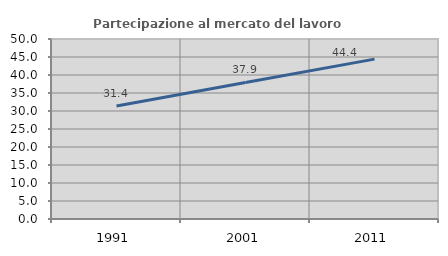
| Category | Partecipazione al mercato del lavoro  femminile |
|---|---|
| 1991.0 | 31.389 |
| 2001.0 | 37.931 |
| 2011.0 | 44.413 |